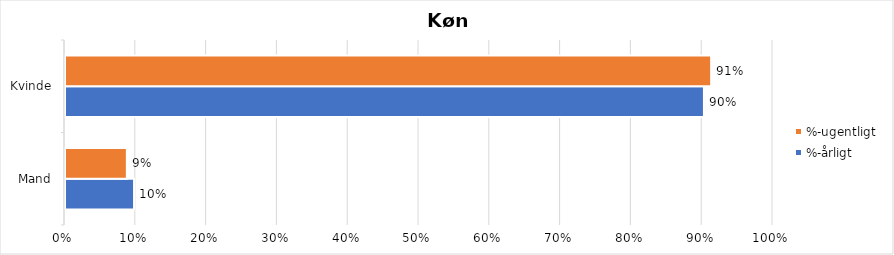
| Category | %-årligt | %-ugentligt |
|---|---|---|
| Mand | 0.098 | 0.087 |
| Kvinde | 0.902 | 0.913 |